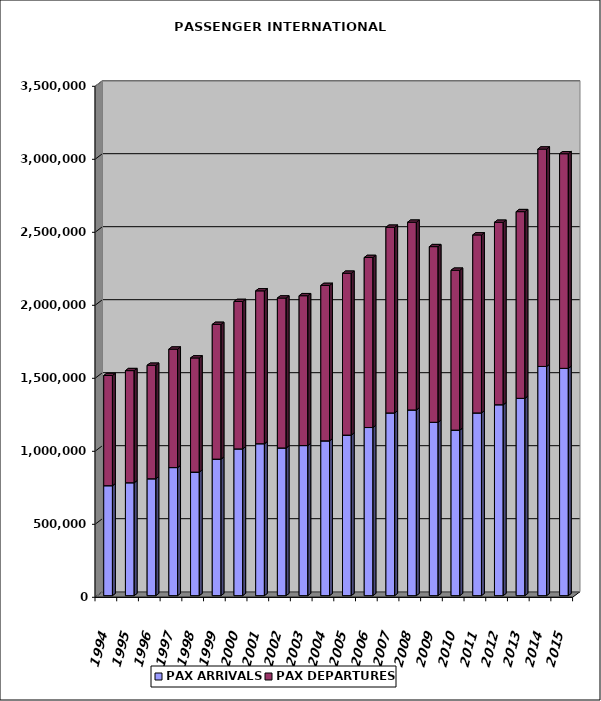
| Category | PAX ARRIVALS | PAX DEPARTURES |
|---|---|---|
| 1994.0 | 753040 | 754601 |
| 1995.0 | 773275 | 767859 |
| 1996.0 | 800500 | 777202 |
| 1997.0 | 877037 | 811393 |
| 1998.0 | 846092 | 781834 |
| 1999.0 | 935030 | 922715 |
| 2000.0 | 1005051 | 1009593 |
| 2001.0 | 1040545 | 1046908 |
| 2002.0 | 1011462 | 1026911 |
| 2003.0 | 1027767 | 1026478 |
| 2004.0 | 1060064 | 1064434 |
| 2005.0 | 1099516 | 1108560 |
| 2006.0 | 1151395 | 1164626 |
| 2007.0 | 1251308 | 1271711 |
| 2008.0 | 1271776 | 1285900 |
| 2009.0 | 1187233 | 1203072 |
| 2010.0 | 1133704 | 1094976 |
| 2011.0 | 1251433 | 1219070 |
| 2012.0 | 1307537 | 1249551 |
| 2013.0 | 1351378 | 1278590 |
| 2014.0 | 1569814 | 1488894 |
| 2015.0 | 1556788 | 1469732 |